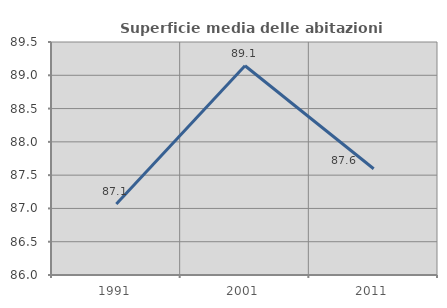
| Category | Superficie media delle abitazioni occupate |
|---|---|
| 1991.0 | 87.068 |
| 2001.0 | 89.143 |
| 2011.0 | 87.596 |